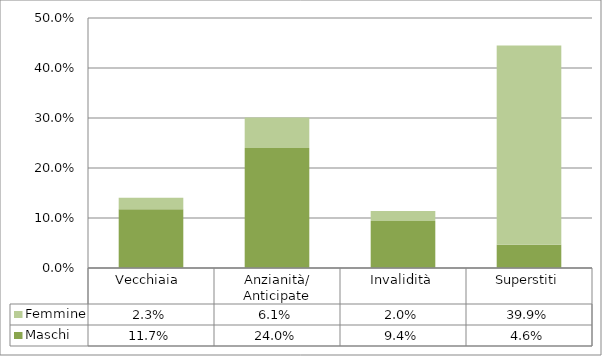
| Category | Maschi | Femmine |
|---|---|---|
| Vecchiaia  | 0.117 | 0.023 |
| Anzianità/ Anticipate | 0.24 | 0.061 |
| Invalidità | 0.094 | 0.02 |
| Superstiti | 0.046 | 0.399 |